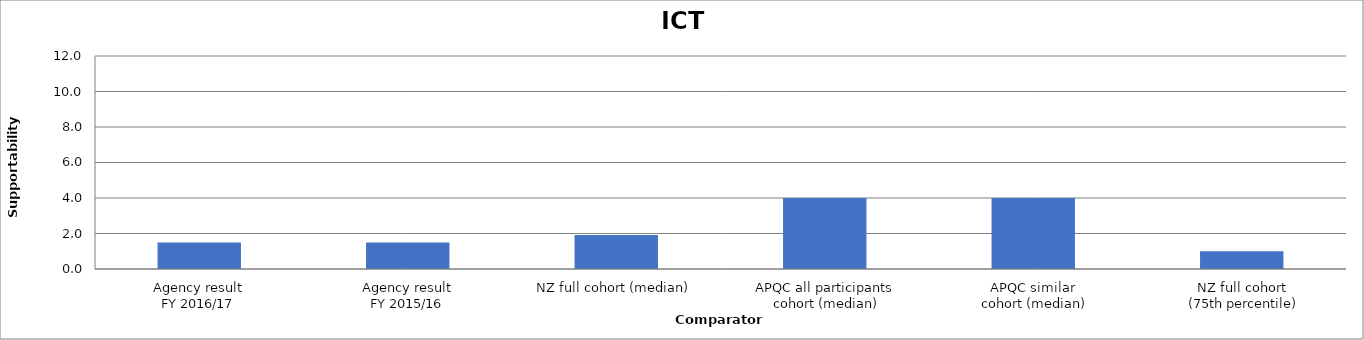
| Category | Result |
|---|---|
| Agency result
FY 2016/17 | 1.5 |
| Agency result
FY 2015/16 | 1.5 |
| NZ full cohort (median) | 1.915 |
| APQC all participants
 cohort (median) | 4 |
| APQC similar
 cohort (median) | 4 |
| NZ full cohort
 (75th percentile) | 1 |